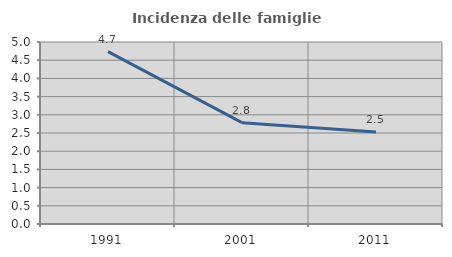
| Category | Incidenza delle famiglie numerose |
|---|---|
| 1991.0 | 4.736 |
| 2001.0 | 2.784 |
| 2011.0 | 2.528 |